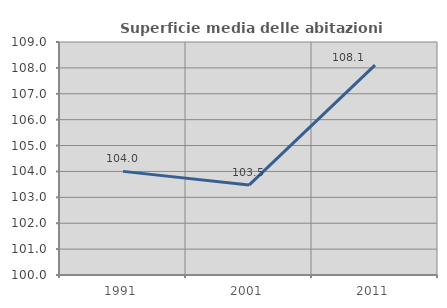
| Category | Superficie media delle abitazioni occupate |
|---|---|
| 1991.0 | 104.003 |
| 2001.0 | 103.474 |
| 2011.0 | 108.11 |